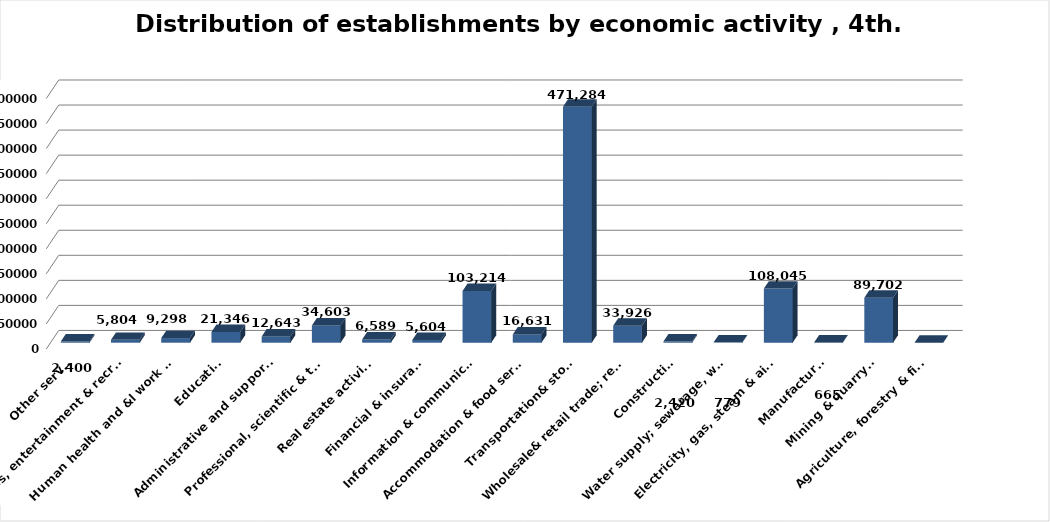
| Category | عدد المنشآت |
|---|---|
| Agriculture, forestry & fishing | 0 |
| Mining & quarrying | 89702 |
| Manufacturing | 665 |
| Electricity, gas, steam & air conditioning supply | 108045 |
| Water supply; sewerage, waste remediation  | 779 |
| Construction | 2420 |
| Wholesale& retail trade; repair of motor vehicles | 33926 |
| Transportation& storage | 471284 |
| Accommodation & food service activities | 16631 |
| Information & communication | 103214 |
| Financial & insurance | 5604 |
| Real estate activities | 6589 |
| Professional, scientific & technical activities | 34603 |
| Administrative and support service activities | 12643 |
| Education | 21346 |
| Human health and &l work activities | 9298 |
| Arts, entertainment & recreation | 5804 |
| Other service | 2400 |